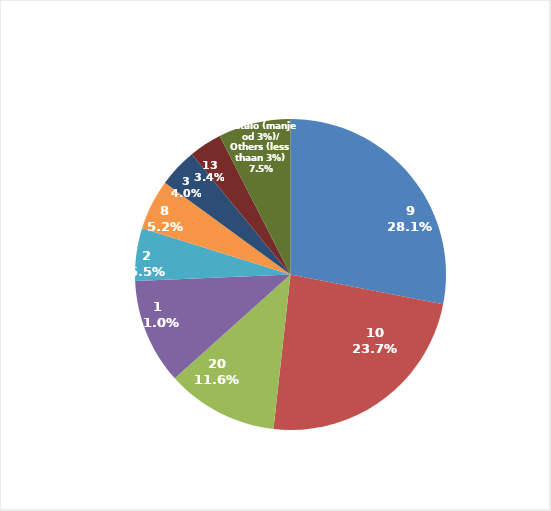
| Category | Series 0 |
|---|---|
| 9 | 3439183.04 |
| 10 | 2903333.29 |
| 20 | 1423276.5 |
| 1 | 1345090.83 |
| 2 | 670949.35 |
| 8 | 642050.94 |
| 3 | 492217.8 |
| 13 | 418173.43 |
|  Ostalo (manje od 3%)/
Others (less thaan 3%) | 922575 |